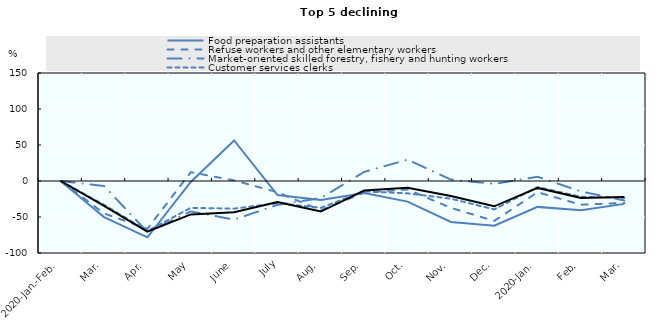
| Category | Food preparation assistants | Refuse workers and other elementary workers | Market-oriented skilled forestry, fishery and hunting workers | Customer services clerks | General and keyboard clerks |
|---|---|---|---|---|---|
| 2020-Jan.-Feb. | 0 | 0 | 0 | 0 | 0 |
| Mar. | -50.178 | -44.932 | -6.985 | -33.122 | -34.666 |
| Apr. | -78.237 | -66.419 | -70.789 | -69.562 | -70.464 |
| May | -1.339 | 12.219 | -42.277 | -37.325 | -46.39 |
| June | 56.291 | 0.838 | -53.624 | -38.393 | -43.265 |
| July | -19.547 | -15.62 | -33.116 | -30.794 | -29.361 |
| Aug. | -26.321 | -40.685 | -23.708 | -37.233 | -42.445 |
| Sep. | -16.702 | -16 | 12.608 | -14.371 | -13.329 |
| Oct. | -28.606 | -11.804 | 29.672 | -17.167 | -9.331 |
| Nov. | -56.891 | -37.31 | 1.959 | -24.56 | -20.721 |
| Dec. | -61.98 | -55.421 | -3.967 | -39.448 | -35.174 |
| 2020-Jan. | -35.947 | -15.585 | 5.837 | -8.413 | -9.607 |
| Feb. | -40.574 | -32.941 | -14.524 | -21.872 | -23.525 |
| Mar. | -31.78 | -30.465 | -26.989 | -23.265 | -22.161 |